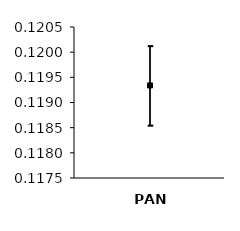
| Category | Series 0 | Series 1 | Series 2 |
|---|---|---|---|
| 0 | 0.12 | 0.119 | 0.119 |